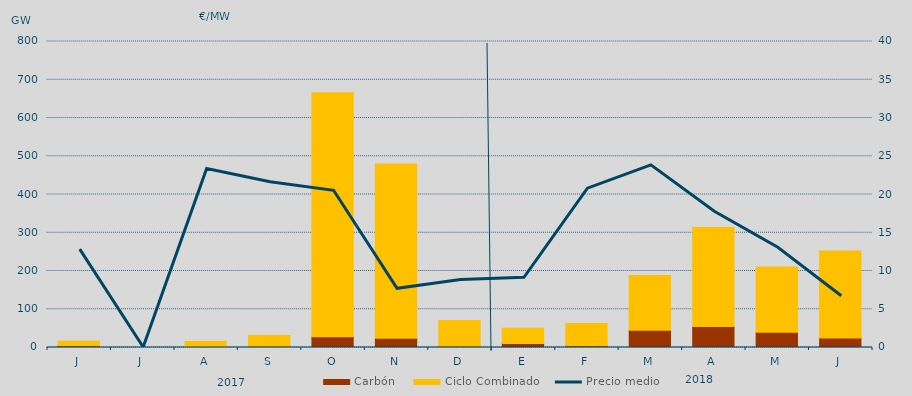
| Category | Carbón | Ciclo Combinado |
|---|---|---|
| J | 4305 | 11713 |
| J | 0 | 0 |
| A | 0 | 15430.5 |
| S | 3306.6 | 27967.5 |
| O | 27914.4 | 638167.2 |
| N | 23926.9 | 455734.5 |
| D | 3200.6 | 67420.5 |
| E | 10696.2 | 39454.7 |
| F | 4341.9 | 58215.4 |
| M | 45246.3 | 142680.5 |
| A | 55123 | 258682.2 |
| M | 40054.5 | 170347.3 |
| J | 24939.8 | 227127.5 |